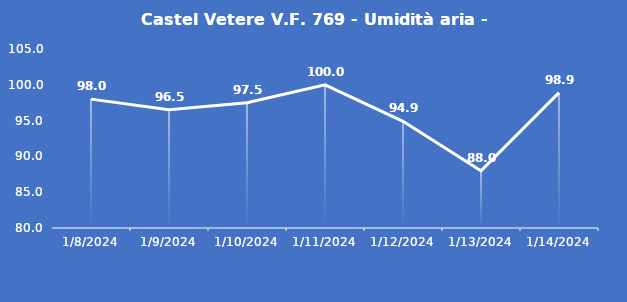
| Category | Castel Vetere V.F. 769 - Umidità aria - Grezzo (%) |
|---|---|
| 1/8/24 | 98 |
| 1/9/24 | 96.5 |
| 1/10/24 | 97.5 |
| 1/11/24 | 100 |
| 1/12/24 | 94.9 |
| 1/13/24 | 88 |
| 1/14/24 | 98.9 |